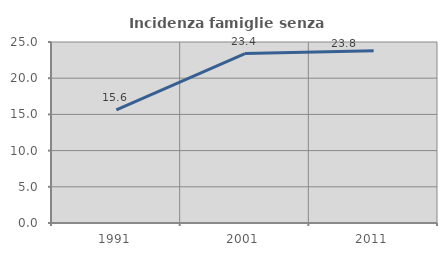
| Category | Incidenza famiglie senza nuclei |
|---|---|
| 1991.0 | 15.625 |
| 2001.0 | 23.398 |
| 2011.0 | 23.801 |